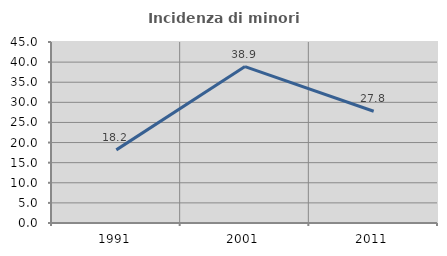
| Category | Incidenza di minori stranieri |
|---|---|
| 1991.0 | 18.182 |
| 2001.0 | 38.889 |
| 2011.0 | 27.778 |